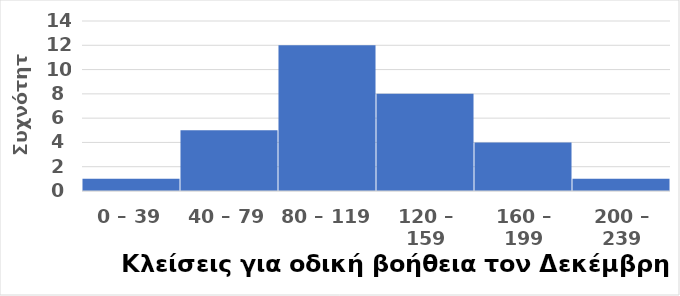
| Category | Συχνότητα |
|---|---|
| 0 – 39 | 1 |
| 40 – 79 | 5 |
| 80 – 119  | 12 |
| 120 – 159 | 8 |
| 160 – 199 | 4 |
| 200 – 239 | 1 |